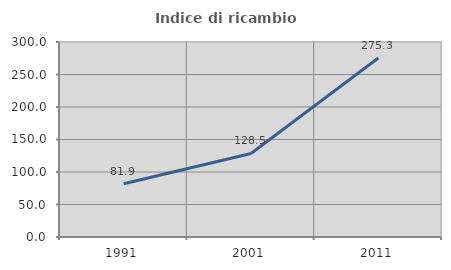
| Category | Indice di ricambio occupazionale  |
|---|---|
| 1991.0 | 81.869 |
| 2001.0 | 128.481 |
| 2011.0 | 275.328 |